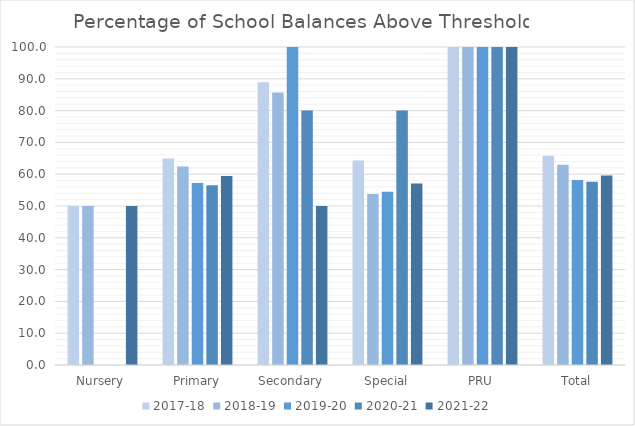
| Category | 2017-18 | 2018-19 | 2019-20 | 2020-21 | 2021-22 |
|---|---|---|---|---|---|
| Nursery | 50 | 50 | 0 | 0 | 50 |
| Primary | 64.9 | 62.4 | 57.2 | 56.5 | 59.4 |
| Secondary | 88.9 | 85.7 | 100 | 80 | 50 |
| Special | 64.3 | 53.8 | 54.5 | 80 | 57.1 |
| PRU | 100 | 100 | 100 | 100 | 100 |
| Total | 65.8 | 63 | 58.2 | 57.6 | 59.6 |